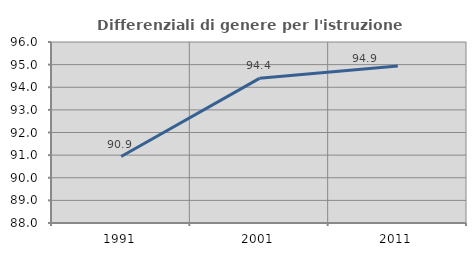
| Category | Differenziali di genere per l'istruzione superiore |
|---|---|
| 1991.0 | 90.939 |
| 2001.0 | 94.394 |
| 2011.0 | 94.942 |